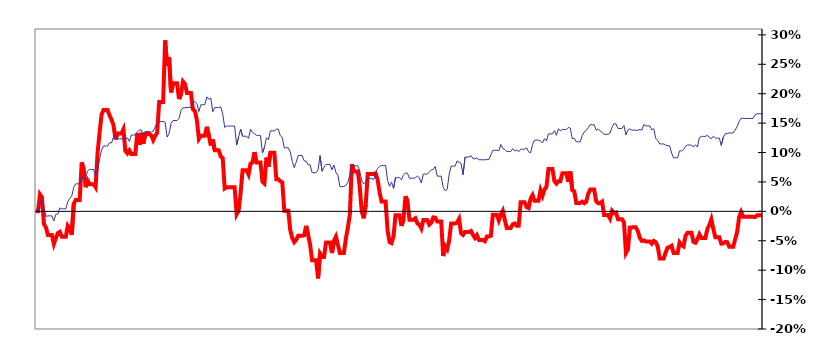
| Category | Series 0 |
|---|---|
| 31/12/2011 | 0 |
| 01/01/2012 | 0 |
| 02/01/2012 | 0.029 |
| 03/01/2012 | 0.024 |
| 04/01/2012 | -0.022 |
| 05/01/2012 | -0.027 |
| 06/01/2012 | -0.04 |
| 07/01/2012 | -0.04 |
| 08/01/2012 | -0.04 |
| 09/01/2012 | -0.055 |
| 10/01/2012 | -0.045 |
| 11/01/2012 | -0.037 |
| 12/01/2012 | -0.035 |
| 13/01/2012 | -0.043 |
| 14/01/2012 | -0.043 |
| 15/01/2012 | -0.043 |
| 16/01/2012 | -0.025 |
| 17/01/2012 | -0.03 |
| 18/01/2012 | -0.04 |
| 19/01/2012 | 0.013 |
| 20/01/2012 | 0.02 |
| 21/01/2012 | 0.02 |
| 22/01/2012 | 0.02 |
| 23/01/2012 | 0.083 |
| 24/01/2012 | 0.072 |
| 25/01/2012 | 0.041 |
| 26/01/2012 | 0.052 |
| 27/01/2012 | 0.046 |
| 28/01/2012 | 0.046 |
| 29/01/2012 | 0.046 |
| 30/01/2012 | 0.041 |
| 31/01/2012 | 0.1 |
| 01/02/2012 | 0.133 |
| 02/02/2012 | 0.164 |
| 03/02/2012 | 0.172 |
| 04/02/2012 | 0.172 |
| 05/02/2012 | 0.172 |
| 06/02/2012 | 0.163 |
| 07/02/2012 | 0.156 |
| 08/02/2012 | 0.147 |
| 09/02/2012 | 0.122 |
| 10/02/2012 | 0.132 |
| 11/02/2012 | 0.132 |
| 12/02/2012 | 0.132 |
| 13/02/2012 | 0.14 |
| 14/02/2012 | 0.103 |
| 15/02/2012 | 0.099 |
| 16/02/2012 | 0.104 |
| 17/02/2012 | 0.098 |
| 18/02/2012 | 0.098 |
| 19/02/2012 | 0.098 |
| 20/02/2012 | 0.132 |
| 21/02/2012 | 0.113 |
| 22/02/2012 | 0.133 |
| 23/02/2012 | 0.115 |
| 24/02/2012 | 0.131 |
| 25/02/2012 | 0.131 |
| 26/02/2012 | 0.131 |
| 27/02/2012 | 0.129 |
| 28/02/2012 | 0.121 |
| 29/02/2012 | 0.128 |
| 01/03/2012 | 0.133 |
| 02/03/2012 | 0.186 |
| 03/03/2012 | 0.186 |
| 04/03/2012 | 0.186 |
| 05/03/2012 | 0.291 |
| 06/03/2012 | 0.247 |
| 07/03/2012 | 0.262 |
| 08/03/2012 | 0.202 |
| 09/03/2012 | 0.218 |
| 10/03/2012 | 0.218 |
| 11/03/2012 | 0.218 |
| 12/03/2012 | 0.191 |
| 13/03/2012 | 0.199 |
| 14/03/2012 | 0.221 |
| 15/03/2012 | 0.217 |
| 16/03/2012 | 0.201 |
| 17/03/2012 | 0.201 |
| 18/03/2012 | 0.201 |
| 19/03/2012 | 0.174 |
| 20/03/2012 | 0.17 |
| 21/03/2012 | 0.155 |
| 22/03/2012 | 0.123 |
| 23/03/2012 | 0.128 |
| 24/03/2012 | 0.128 |
| 25/03/2012 | 0.128 |
| 26/03/2012 | 0.144 |
| 27/03/2012 | 0.129 |
| 28/03/2012 | 0.112 |
| 29/03/2012 | 0.122 |
| 30/03/2012 | 0.104 |
| 31/03/2012 | 0.104 |
| 01/04/2012 | 0.104 |
| 02/04/2012 | 0.093 |
| 03/04/2012 | 0.09 |
| 04/04/2012 | 0.039 |
| 05/04/2012 | 0.041 |
| 06/04/2012 | 0.041 |
| 07/04/2012 | 0.041 |
| 08/04/2012 | 0.041 |
| 09/04/2012 | 0.041 |
| 10/04/2012 | -0.005 |
| 11/04/2012 | 0.001 |
| 12/04/2012 | 0.031 |
| 13/04/2012 | 0.07 |
| 14/04/2012 | 0.07 |
| 15/04/2012 | 0.07 |
| 16/04/2012 | 0.063 |
| 17/04/2012 | 0.081 |
| 18/04/2012 | 0.083 |
| 19/04/2012 | 0.101 |
| 20/04/2012 | 0.083 |
| 21/04/2012 | 0.083 |
| 22/04/2012 | 0.083 |
| 23/04/2012 | 0.05 |
| 24/04/2012 | 0.047 |
| 25/04/2012 | 0.091 |
| 26/04/2012 | 0.076 |
| 27/04/2012 | 0.1 |
| 28/04/2012 | 0.1 |
| 29/04/2012 | 0.1 |
| 30/04/2012 | 0.054 |
| 01/05/2012 | 0.054 |
| 02/05/2012 | 0.051 |
| 03/05/2012 | 0.049 |
| 04/05/2012 | 0.001 |
| 05/05/2012 | 0.001 |
| 06/05/2012 | 0.001 |
| 07/05/2012 | -0.032 |
| 08/05/2012 | -0.045 |
| 09/05/2012 | -0.052 |
| 10/05/2012 | -0.048 |
| 11/05/2012 | -0.042 |
| 12/05/2012 | -0.042 |
| 13/05/2012 | -0.042 |
| 14/05/2012 | -0.041 |
| 15/05/2012 | -0.025 |
| 16/05/2012 | -0.04 |
| 17/05/2012 | -0.056 |
| 18/05/2012 | -0.083 |
| 19/05/2012 | -0.083 |
| 20/05/2012 | -0.083 |
| 21/05/2012 | -0.114 |
| 22/05/2012 | -0.072 |
| 23/05/2012 | -0.078 |
| 24/05/2012 | -0.078 |
| 25/05/2012 | -0.053 |
| 26/05/2012 | -0.053 |
| 27/05/2012 | -0.053 |
| 28/05/2012 | -0.071 |
| 29/05/2012 | -0.05 |
| 30/05/2012 | -0.043 |
| 31/05/2012 | -0.057 |
| 01/06/2012 | -0.071 |
| 02/06/2012 | -0.071 |
| 03/06/2012 | -0.071 |
| 04/06/2012 | -0.046 |
| 05/06/2012 | -0.028 |
| 06/06/2012 | -0.006 |
| 07/06/2012 | 0.08 |
| 08/06/2012 | 0.068 |
| 09/06/2012 | 0.068 |
| 10/06/2012 | 0.068 |
| 11/06/2012 | 0.041 |
| 12/06/2012 | -0.001 |
| 13/06/2012 | -0.012 |
| 14/06/2012 | 0.011 |
| 15/06/2012 | 0.064 |
| 16/06/2012 | 0.064 |
| 17/06/2012 | 0.064 |
| 18/06/2012 | 0.064 |
| 19/06/2012 | 0.065 |
| 20/06/2012 | 0.053 |
| 21/06/2012 | 0.032 |
| 22/06/2012 | 0.017 |
| 23/06/2012 | 0.017 |
| 24/06/2012 | 0.017 |
| 25/06/2012 | -0.032 |
| 26/06/2012 | -0.052 |
| 27/06/2012 | -0.054 |
| 28/06/2012 | -0.042 |
| 29/06/2012 | -0.007 |
| 30/06/2012 | -0.007 |
| 01/07/2012 | -0.007 |
| 02/07/2012 | -0.025 |
| 03/07/2012 | -0.014 |
| 04/07/2012 | 0.026 |
| 05/07/2012 | 0.018 |
| 06/07/2012 | -0.014 |
| 07/07/2012 | -0.014 |
| 08/07/2012 | -0.014 |
| 09/07/2012 | -0.012 |
| 10/07/2012 | -0.021 |
| 11/07/2012 | -0.023 |
| 12/07/2012 | -0.029 |
| 13/07/2012 | -0.015 |
| 14/07/2012 | -0.015 |
| 15/07/2012 | -0.015 |
| 16/07/2012 | -0.023 |
| 17/07/2012 | -0.02 |
| 18/07/2012 | -0.01 |
| 19/07/2012 | -0.011 |
| 20/07/2012 | -0.017 |
| 21/07/2012 | -0.017 |
| 22/07/2012 | -0.017 |
| 23/07/2012 | -0.076 |
| 24/07/2012 | -0.06 |
| 25/07/2012 | -0.065 |
| 26/07/2012 | -0.049 |
| 27/07/2012 | -0.021 |
| 28/07/2012 | -0.021 |
| 29/07/2012 | -0.021 |
| 30/07/2012 | -0.02 |
| 31/07/2012 | -0.013 |
| 01/08/2012 | -0.037 |
| 02/08/2012 | -0.04 |
| 03/08/2012 | -0.035 |
| 04/08/2012 | -0.035 |
| 05/08/2012 | -0.035 |
| 06/08/2012 | -0.033 |
| 07/08/2012 | -0.04 |
| 08/08/2012 | -0.045 |
| 09/08/2012 | -0.041 |
| 10/08/2012 | -0.049 |
| 11/08/2012 | -0.049 |
| 12/08/2012 | -0.049 |
| 13/08/2012 | -0.051 |
| 14/08/2012 | -0.043 |
| 15/08/2012 | -0.043 |
| 16/08/2012 | -0.042 |
| 17/08/2012 | -0.006 |
| 18/08/2012 | -0.006 |
| 19/08/2012 | -0.006 |
| 20/08/2012 | -0.015 |
| 21/08/2012 | -0.005 |
| 22/08/2012 | 0.001 |
| 23/08/2012 | -0.014 |
| 24/08/2012 | -0.028 |
| 25/08/2012 | -0.028 |
| 26/08/2012 | -0.028 |
| 27/08/2012 | -0.022 |
| 28/08/2012 | -0.021 |
| 29/08/2012 | -0.025 |
| 30/08/2012 | -0.025 |
| 31/08/2012 | 0.015 |
| 01/09/2012 | 0.015 |
| 02/09/2012 | 0.015 |
| 03/09/2012 | 0.007 |
| 04/09/2012 | 0.006 |
| 05/09/2012 | 0.022 |
| 06/09/2012 | 0.028 |
| 07/09/2012 | 0.018 |
| 08/09/2012 | 0.018 |
| 09/09/2012 | 0.018 |
| 10/09/2012 | 0.036 |
| 11/09/2012 | 0.027 |
| 12/09/2012 | 0.037 |
| 13/09/2012 | 0.042 |
| 14/09/2012 | 0.072 |
| 15/09/2012 | 0.072 |
| 16/09/2012 | 0.072 |
| 17/09/2012 | 0.051 |
| 18/09/2012 | 0.047 |
| 19/09/2012 | 0.051 |
| 20/09/2012 | 0.051 |
| 21/09/2012 | 0.065 |
| 22/09/2012 | 0.065 |
| 23/09/2012 | 0.065 |
| 24/09/2012 | 0.05 |
| 25/09/2012 | 0.068 |
| 26/09/2012 | 0.036 |
| 27/09/2012 | 0.034 |
| 28/09/2012 | 0.014 |
| 29/09/2012 | 0.014 |
| 30/09/2012 | 0.014 |
| 01/10/2012 | 0.016 |
| 02/10/2012 | 0.014 |
| 03/10/2012 | 0.016 |
| 04/10/2012 | 0.03 |
| 05/10/2012 | 0.037 |
| 06/10/2012 | 0.037 |
| 07/10/2012 | 0.037 |
| 08/10/2012 | 0.017 |
| 09/10/2012 | 0.014 |
| 10/10/2012 | 0.014 |
| 11/10/2012 | 0.016 |
| 12/10/2012 | -0.006 |
| 13/10/2012 | -0.006 |
| 14/10/2012 | -0.006 |
| 15/10/2012 | -0.012 |
| 16/10/2012 | 0.001 |
| 17/10/2012 | -0.003 |
| 18/10/2012 | -0.002 |
| 19/10/2012 | -0.013 |
| 20/10/2012 | -0.013 |
| 21/10/2012 | -0.013 |
| 22/10/2012 | -0.018 |
| 23/10/2012 | -0.071 |
| 24/10/2012 | -0.065 |
| 25/10/2012 | -0.028 |
| 26/10/2012 | -0.027 |
| 27/10/2012 | -0.027 |
| 28/10/2012 | -0.027 |
| 29/10/2012 | -0.034 |
| 30/10/2012 | -0.045 |
| 31/10/2012 | -0.05 |
| 01/11/2012 | -0.049 |
| 02/11/2012 | -0.051 |
| 03/11/2012 | -0.051 |
| 04/11/2012 | -0.051 |
| 05/11/2012 | -0.055 |
| 06/11/2012 | -0.05 |
| 07/11/2012 | -0.052 |
| 08/11/2012 | -0.06 |
| 09/11/2012 | -0.08 |
| 10/11/2012 | -0.08 |
| 11/11/2012 | -0.08 |
| 12/11/2012 | -0.07 |
| 13/11/2012 | -0.062 |
| 14/11/2012 | -0.061 |
| 15/11/2012 | -0.059 |
| 16/11/2012 | -0.071 |
| 17/11/2012 | -0.071 |
| 18/11/2012 | -0.071 |
| 19/11/2012 | -0.053 |
| 20/11/2012 | -0.057 |
| 21/11/2012 | -0.06 |
| 22/11/2012 | -0.042 |
| 23/11/2012 | -0.036 |
| 24/11/2012 | -0.036 |
| 25/11/2012 | -0.036 |
| 26/11/2012 | -0.052 |
| 27/11/2012 | -0.053 |
| 28/11/2012 | -0.047 |
| 29/11/2012 | -0.039 |
| 30/11/2012 | -0.045 |
| 01/12/2012 | -0.045 |
| 02/12/2012 | -0.045 |
| 03/12/2012 | -0.03 |
| 04/12/2012 | -0.023 |
| 05/12/2012 | -0.013 |
| 06/12/2012 | -0.03 |
| 07/12/2012 | -0.044 |
| 08/12/2012 | -0.044 |
| 09/12/2012 | -0.044 |
| 10/12/2012 | -0.055 |
| 11/12/2012 | -0.054 |
| 12/12/2012 | -0.052 |
| 13/12/2012 | -0.052 |
| 14/12/2012 | -0.06 |
| 15/12/2012 | -0.06 |
| 16/12/2012 | -0.06 |
| 17/12/2012 | -0.047 |
| 18/12/2012 | -0.035 |
| 19/12/2012 | -0.009 |
| 20/12/2012 | -0.001 |
| 21/12/2012 | -0.009 |
| 22/12/2012 | -0.009 |
| 23/12/2012 | -0.009 |
| 24/12/2012 | -0.009 |
| 25/12/2012 | -0.009 |
| 26/12/2012 | -0.009 |
| 27/12/2012 | -0.01 |
| 28/12/2012 | -0.007 |
| 29/12/2012 | -0.007 |
| 30/12/2012 | -0.007 |
| 31/12/2012 | -0.007 |